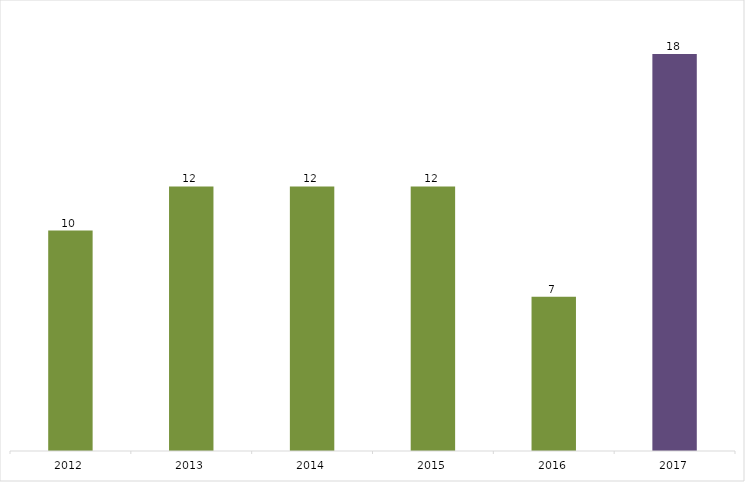
| Category | Ranking |
|---|---|
| 2012.0 | 10 |
| 2013.0 | 12 |
| 2014.0 | 12 |
| 2015.0 | 12 |
| 2016.0 | 7 |
| 2017.0 | 18 |